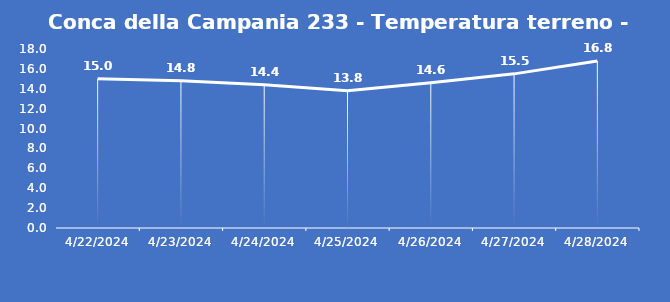
| Category | Conca della Campania 233 - Temperatura terreno - Grezzo (°C) |
|---|---|
| 4/22/24 | 15 |
| 4/23/24 | 14.8 |
| 4/24/24 | 14.4 |
| 4/25/24 | 13.8 |
| 4/26/24 | 14.6 |
| 4/27/24 | 15.5 |
| 4/28/24 | 16.8 |